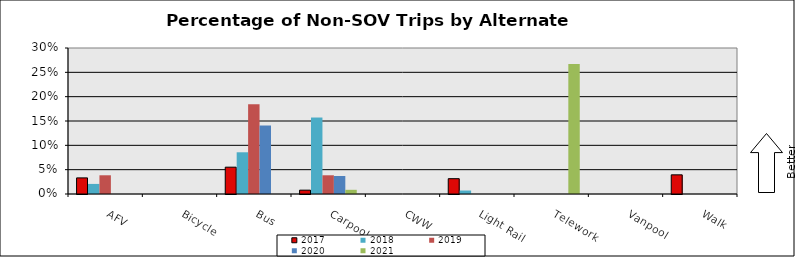
| Category | 2017 | 2018 | 2019 | 2020 | 2021 |
|---|---|---|---|---|---|
| AFV | 0.033 | 0.021 | 0.038 | 0 | 0 |
| Bicycle | 0 | 0 | 0 | 0 | 0 |
| Bus | 0.055 | 0.086 | 0.185 | 0.141 | 0 |
| Carpool | 0.008 | 0.157 | 0.038 | 0.037 | 0.009 |
| CWW | 0 | 0 | 0 | 0 | 0 |
| Light Rail | 0.031 | 0.007 | 0 | 0 | 0 |
| Telework | 0 | 0 | 0 | 0 | 0.267 |
| Vanpool | 0 | 0 | 0 | 0 | 0 |
| Walk | 0.039 | 0 | 0 | 0 | 0 |